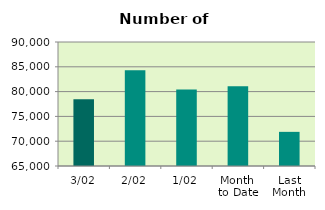
| Category | Series 0 |
|---|---|
| 3/02 | 78470 |
| 2/02 | 84284 |
| 1/02 | 80444 |
| Month 
to Date | 81066 |
| Last
Month | 71883.3 |